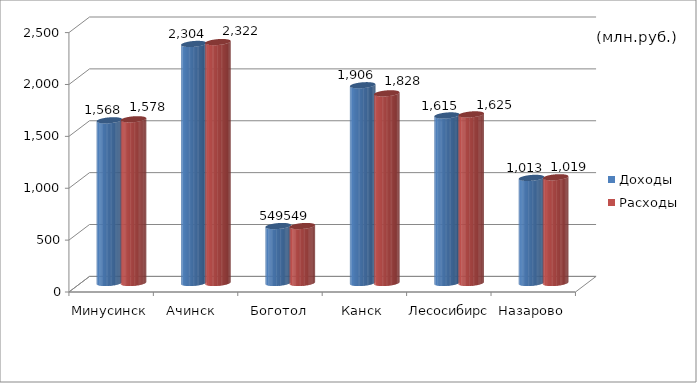
| Category | Доходы | Расходы |
|---|---|---|
| Минусинск | 1568 | 1578 |
| Ачинск  | 2304 | 2322 |
| Боготол | 549 | 549 |
| Канск | 1906 | 1828 |
| Лесосибирск | 1615 | 1625 |
| Назарово | 1013 | 1019 |